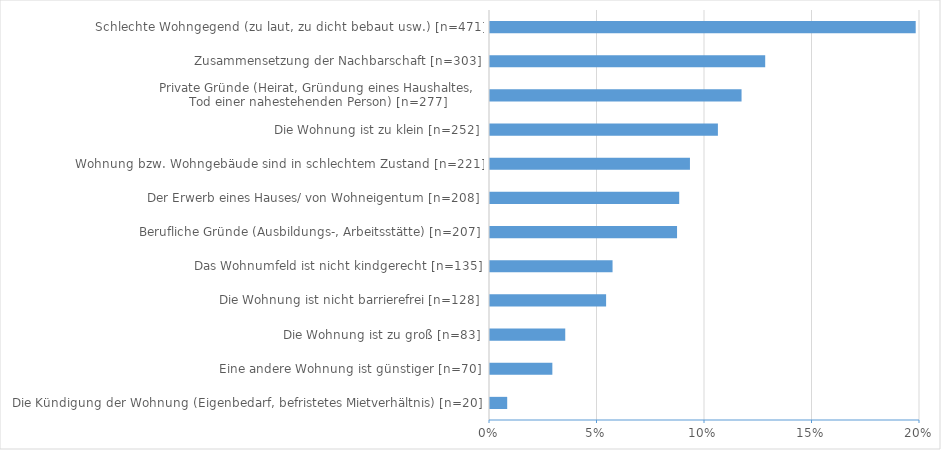
| Category | Series 0 |
|---|---|
| Die Kündigung der Wohnung (Eigenbedarf, befristetes Mietverhältnis) [n=20] | 0.008 |
| Eine andere Wohnung ist günstiger [n=70] | 0.029 |
| Die Wohnung ist zu groß [n=83] | 0.035 |
| Die Wohnung ist nicht barrierefrei [n=128] | 0.054 |
| Das Wohnumfeld ist nicht kindgerecht [n=135] | 0.057 |
| Berufliche Gründe (Ausbildungs-, Arbeitsstätte) [n=207] | 0.087 |
| Der Erwerb eines Hauses/ von Wohneigentum [n=208] | 0.088 |
| Wohnung bzw. Wohngebäude sind in schlechtem Zustand [n=221] | 0.093 |
| Die Wohnung ist zu klein [n=252] | 0.106 |
| Private Gründe (Heirat, Gründung eines Haushaltes, 
Tod einer nahestehenden Person) [n=277] | 0.117 |
| Zusammensetzung der Nachbarschaft [n=303] | 0.128 |
| Schlechte Wohngegend (zu laut, zu dicht bebaut usw.) [n=471] | 0.198 |